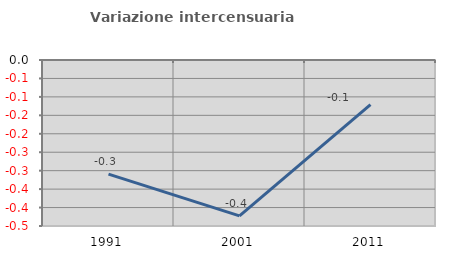
| Category | Variazione intercensuaria annua |
|---|---|
| 1991.0 | -0.31 |
| 2001.0 | -0.423 |
| 2011.0 | -0.121 |